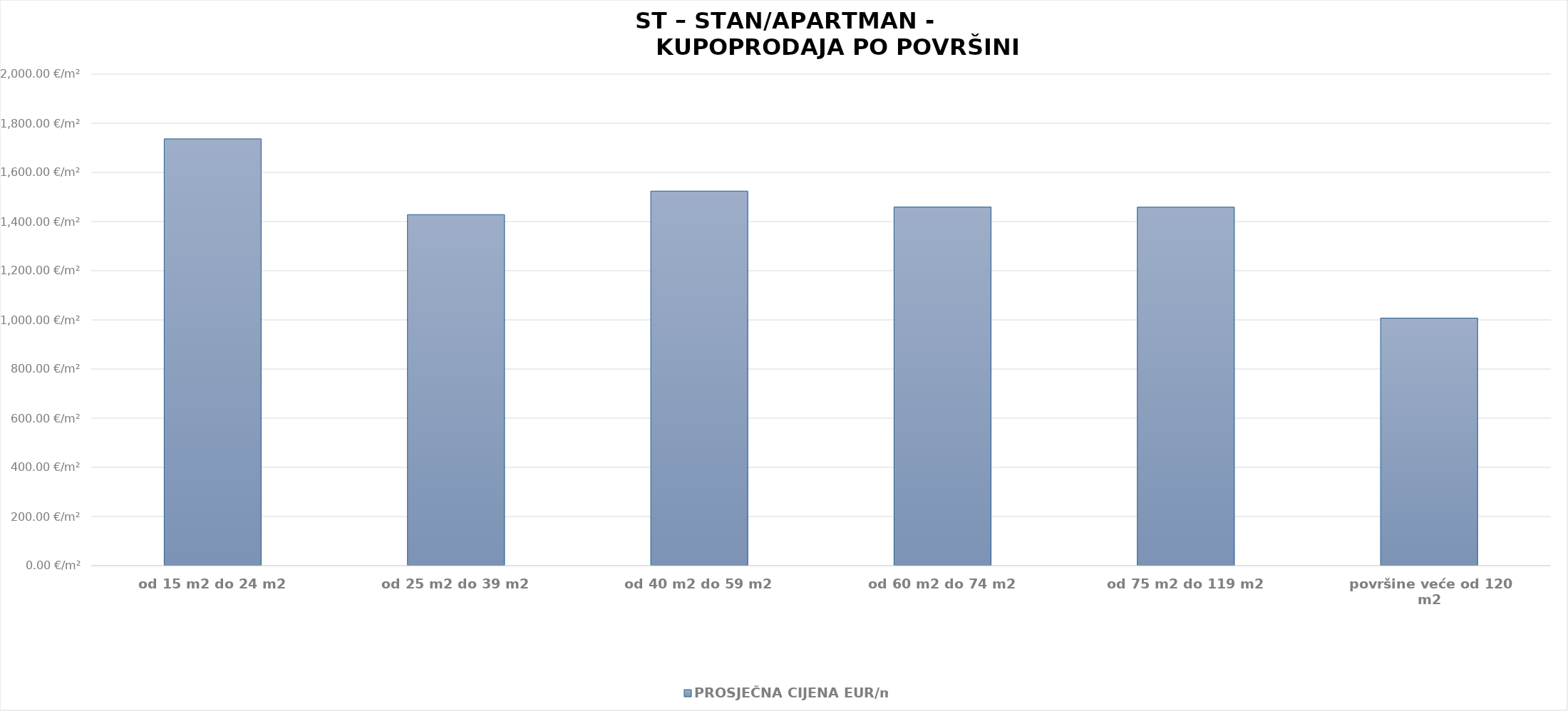
| Category | PROSJEČNA CIJENA EUR/m2 |
|---|---|
| od 15 m2 do 24 m2 | 1904-10-01 11:07:25 |
| od 25 m2 do 39 m2 | 1903-11-28 04:53:46 |
| od 40 m2 do 59 m2 | 1904-03-02 23:48:13 |
| od 60 m2 do 74 m2 | 1903-12-29 01:41:21 |
| od 75 m2 do 119 m2 | 1903-12-28 13:35:19 |
| površine veće od 120 m2 | 1902-10-03 02:46:44 |